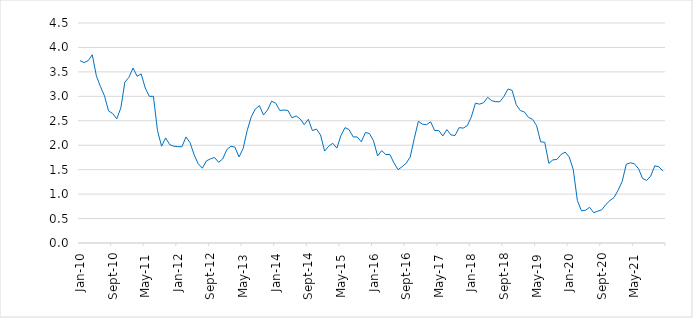
| Category | Series 0 |
|---|---|
| 2010-01-01 | 3.73 |
| 2010-02-01 | 3.69 |
| 2010-03-01 | 3.73 |
| 2010-04-01 | 3.85 |
| 2010-05-01 | 3.42 |
| 2010-06-01 | 3.2 |
| 2010-07-01 | 3.01 |
| 2010-08-01 | 2.7 |
| 2010-09-01 | 2.65 |
| 2010-10-01 | 2.54 |
| 2010-11-01 | 2.76 |
| 2010-12-01 | 3.29 |
| 2011-01-01 | 3.39 |
| 2011-02-01 | 3.58 |
| 2011-03-01 | 3.41 |
| 2011-04-01 | 3.46 |
| 2011-05-01 | 3.17 |
| 2011-06-01 | 3 |
| 2011-07-01 | 3 |
| 2011-08-01 | 2.3 |
| 2011-09-01 | 1.98 |
| 2011-10-01 | 2.15 |
| 2011-11-01 | 2.01 |
| 2011-12-01 | 1.98 |
| 2012-01-01 | 1.97 |
| 2012-02-01 | 1.97 |
| 2012-03-01 | 2.17 |
| 2012-04-01 | 2.05 |
| 2012-05-01 | 1.8 |
| 2012-06-01 | 1.62 |
| 2012-07-01 | 1.53 |
| 2012-08-01 | 1.68 |
| 2012-09-01 | 1.72 |
| 2012-10-01 | 1.75 |
| 2012-11-01 | 1.65 |
| 2012-12-01 | 1.72 |
| 2013-01-01 | 1.91 |
| 2013-02-01 | 1.98 |
| 2013-03-01 | 1.96 |
| 2013-04-01 | 1.76 |
| 2013-05-01 | 1.93 |
| 2013-06-01 | 2.3 |
| 2013-07-01 | 2.58 |
| 2013-08-01 | 2.74 |
| 2013-09-01 | 2.81 |
| 2013-10-01 | 2.62 |
| 2013-11-01 | 2.72 |
| 2013-12-01 | 2.9 |
| 2014-01-01 | 2.86 |
| 2014-02-01 | 2.71 |
| 2014-03-01 | 2.72 |
| 2014-04-01 | 2.71 |
| 2014-05-01 | 2.56 |
| 2014-06-01 | 2.6 |
| 2014-07-01 | 2.54 |
| 2014-08-01 | 2.42 |
| 2014-09-01 | 2.53 |
| 2014-10-01 | 2.3 |
| 2014-11-01 | 2.33 |
| 2014-12-01 | 2.21 |
| 2015-01-01 | 1.88 |
| 2015-02-01 | 1.98 |
| 2015-03-01 | 2.04 |
| 2015-04-01 | 1.94 |
| 2015-05-01 | 2.2 |
| 2015-06-01 | 2.36 |
| 2015-07-01 | 2.32 |
| 2015-08-01 | 2.17 |
| 2015-09-01 | 2.17 |
| 2015-10-01 | 2.07 |
| 2015-11-01 | 2.26 |
| 2015-12-01 | 2.24 |
| 2016-01-01 | 2.09 |
| 2016-02-01 | 1.78 |
| 2016-03-01 | 1.89 |
| 2016-04-01 | 1.81 |
| 2016-05-01 | 1.81 |
| 2016-06-01 | 1.64 |
| 2016-07-01 | 1.5 |
| 2016-08-01 | 1.56 |
| 2016-09-01 | 1.63 |
| 2016-10-01 | 1.76 |
| 2016-11-01 | 2.14 |
| 2016-12-01 | 2.49 |
| 2017-01-01 | 2.43 |
| 2017-02-01 | 2.42 |
| 2017-03-01 | 2.48 |
| 2017-04-01 | 2.3 |
| 2017-05-01 | 2.3 |
| 2017-06-01 | 2.19 |
| 2017-07-01 | 2.32 |
| 2017-08-01 | 2.21 |
| 2017-09-01 | 2.2 |
| 2017-10-01 | 2.36 |
| 2017-11-01 | 2.35 |
| 2017-12-01 | 2.4 |
| 2018-01-01 | 2.58 |
| 2018-02-01 | 2.86 |
| 2018-03-01 | 2.84 |
| 2018-04-01 | 2.87 |
| 2018-05-01 | 2.98 |
| 2018-06-01 | 2.91 |
| 2018-07-01 | 2.89 |
| 2018-08-01 | 2.89 |
| 2018-09-01 | 3 |
| 2018-10-01 | 3.15 |
| 2018-11-01 | 3.12 |
| 2018-12-01 | 2.83 |
| 2019-01-01 | 2.71 |
| 2019-02-01 | 2.68 |
| 2019-03-01 | 2.57 |
| 2019-04-01 | 2.53 |
| 2019-05-01 | 2.4 |
| 2019-06-01 | 2.07 |
| 2019-07-01 | 2.06 |
| 2019-08-01 | 1.63 |
| 2019-09-01 | 1.7 |
| 2019-10-01 | 1.71 |
| 2019-11-01 | 1.81 |
| 2019-12-01 | 1.86 |
| 2020-01-01 | 1.76 |
| 2020-02-01 | 1.5 |
| 2020-03-01 | 0.87 |
| 2020-04-01 | 0.66 |
| 2020-05-01 | 0.67 |
| 2020-06-01 | 0.73 |
| 2020-07-01 | 0.62 |
| 2020-08-01 | 0.65 |
| 2020-09-01 | 0.68 |
| 2020-10-01 | 0.79 |
| 2020-11-01 | 0.87 |
| 2020-12-01 | 0.93 |
| 2021-01-01 | 1.08 |
| 2021-02-01 | 1.26 |
| 2021-03-01 | 1.61 |
| 2021-04-01 | 1.64 |
| 2021-05-01 | 1.62 |
| 2021-06-01 | 1.52 |
| 2021-07-01 | 1.32 |
| 2021-08-01 | 1.28 |
| 2021-09-01 | 1.37 |
| 2021-10-01 | 1.58 |
| 2021-11-01 | 1.56 |
| 2021-12-01 | 1.47 |